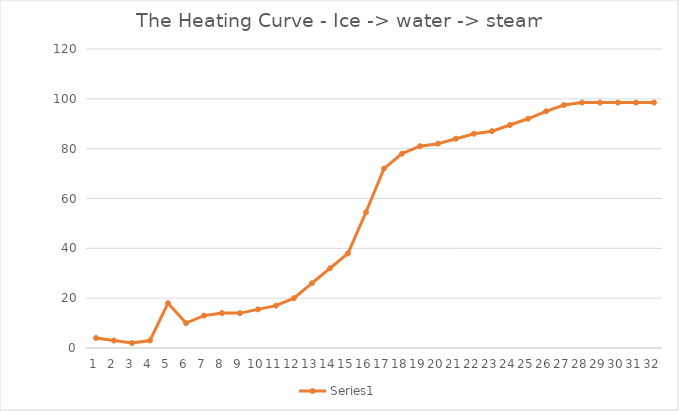
| Category | Series 1 |
|---|---|
| 0 | 4 |
| 1 | 3 |
| 2 | 2 |
| 3 | 3 |
| 4 | 18 |
| 5 | 10 |
| 6 | 13 |
| 7 | 14 |
| 8 | 14 |
| 9 | 15.5 |
| 10 | 17 |
| 11 | 20 |
| 12 | 26 |
| 13 | 32 |
| 14 | 38 |
| 15 | 54.5 |
| 16 | 72 |
| 17 | 78 |
| 18 | 81 |
| 19 | 82 |
| 20 | 84 |
| 21 | 86 |
| 22 | 87 |
| 23 | 89.5 |
| 24 | 92 |
| 25 | 95 |
| 26 | 97.5 |
| 27 | 98.5 |
| 28 | 98.5 |
| 29 | 98.5 |
| 30 | 98.5 |
| 31 | 98.5 |